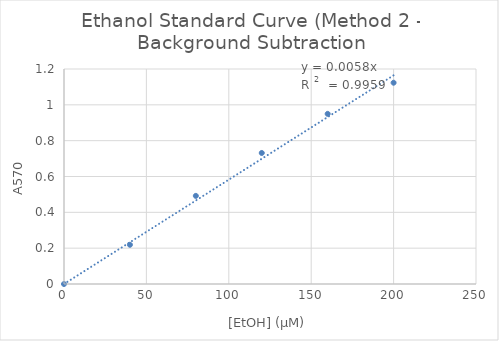
| Category | Series 0 |
|---|---|
| 0.0 | 0 |
| 40.0 | 0.219 |
| 80.0 | 0.492 |
| 120.0 | 0.731 |
| 160.0 | 0.95 |
| 200.0 | 1.123 |